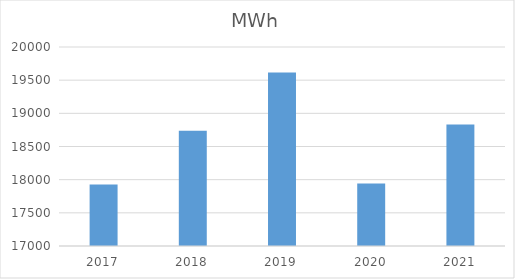
| Category | MWh |
|---|---|
| 2017.0 | 17927.892 |
| 2018.0 | 18738.522 |
| 2019.0 | 19614.201 |
| 2020.0 | 17940.45 |
| 2021.0 | 18830.693 |